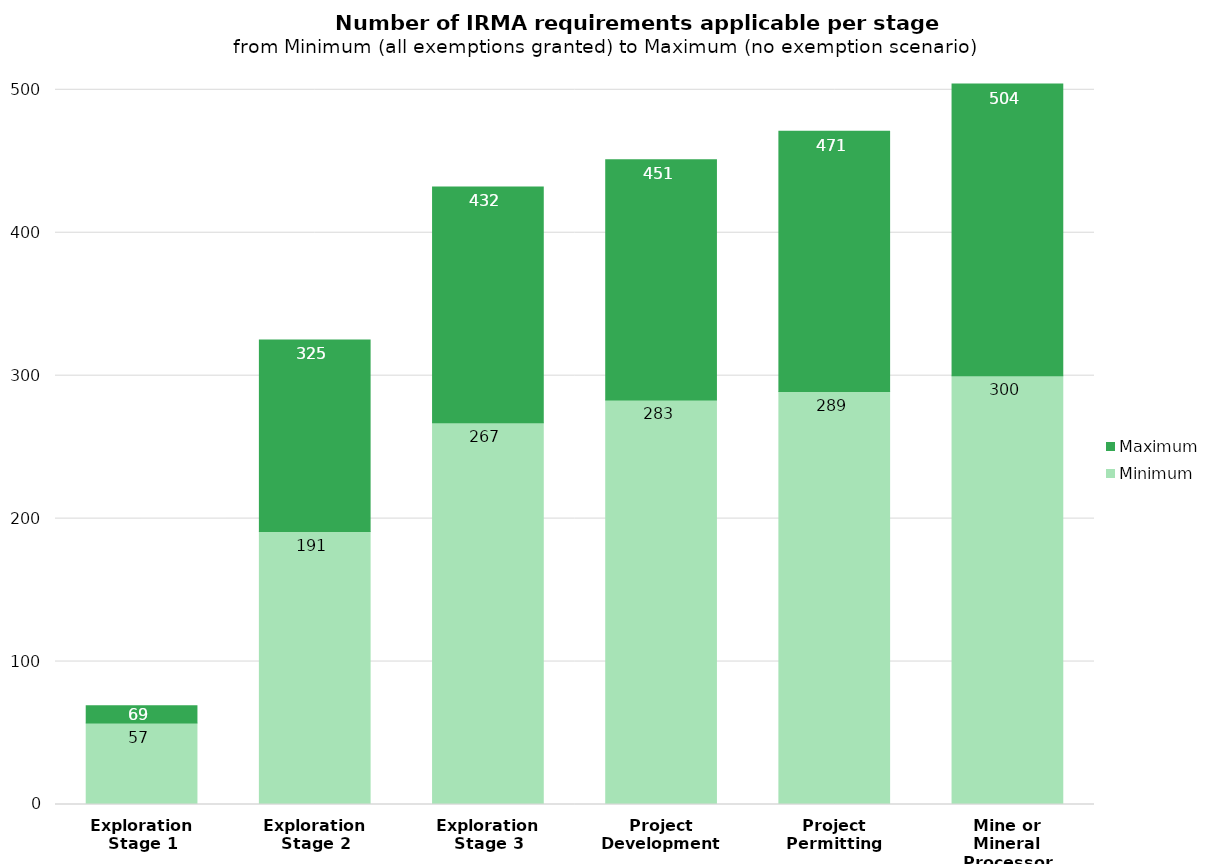
| Category | Minimum | Maximum |
|---|---|---|
| Exploration
Stage 1 | 57 | 12 |
| Exploration
Stage 2 | 191 | 134 |
| Exploration
Stage 3 | 267 | 165 |
| Project
Development | 283 | 168 |
| Project
Permitting | 289 | 182 |
| Mine or Mineral Processor | 300 | 204 |